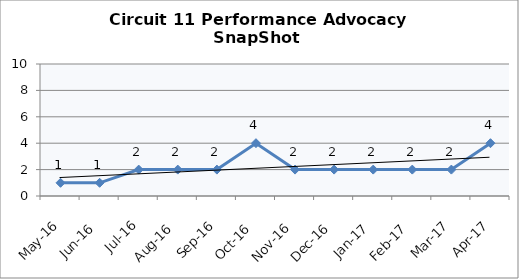
| Category | Circuit 11 |
|---|---|
| May-16 | 1 |
| Jun-16 | 1 |
| Jul-16 | 2 |
| Aug-16 | 2 |
| Sep-16 | 2 |
| Oct-16 | 4 |
| Nov-16 | 2 |
| Dec-16 | 2 |
| Jan-17 | 2 |
| Feb-17 | 2 |
| Mar-17 | 2 |
| Apr-17 | 4 |